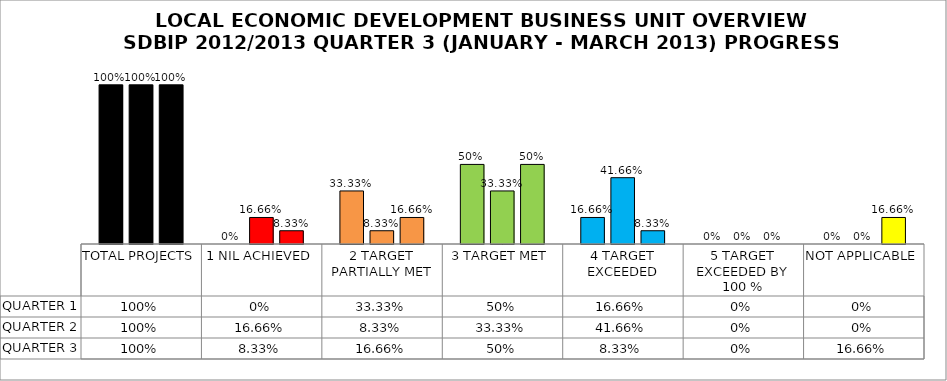
| Category | QUARTER 1 | QUARTER 2 | QUARTER 3 |
|---|---|---|---|
| TOTAL PROJECTS | 1 | 1 | 1 |
| 1 NIL ACHIEVED | 0 | 0.167 | 0.083 |
| 2 TARGET PARTIALLY MET | 0.333 | 0.083 | 0.167 |
| 3 TARGET MET | 0.5 | 0.333 | 0.5 |
| 4 TARGET EXCEEDED | 0.167 | 0.417 | 0.083 |
| 5 TARGET EXCEEDED BY 100 % | 0 | 0 | 0 |
| NOT APPLICABLE | 0 | 0 | 0.167 |